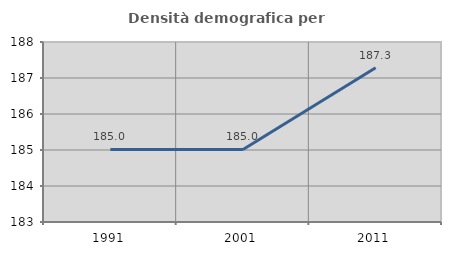
| Category | Densità demografica |
|---|---|
| 1991.0 | 185.015 |
| 2001.0 | 185.015 |
| 2011.0 | 187.287 |